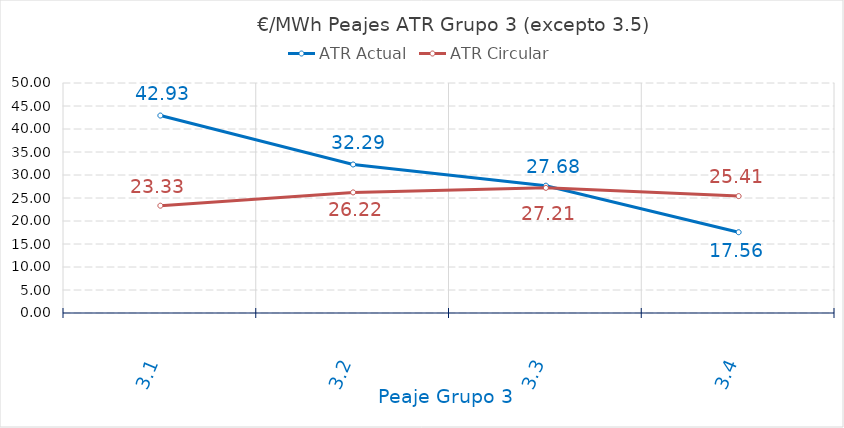
| Category | ATR Actual | ATR Circular |
|---|---|---|
| 3.1 | 42.925 | 23.329 |
| 3.2 | 32.286 | 26.217 |
| 3.3 | 27.68 | 27.206 |
| 3.4 | 17.56 | 25.411 |